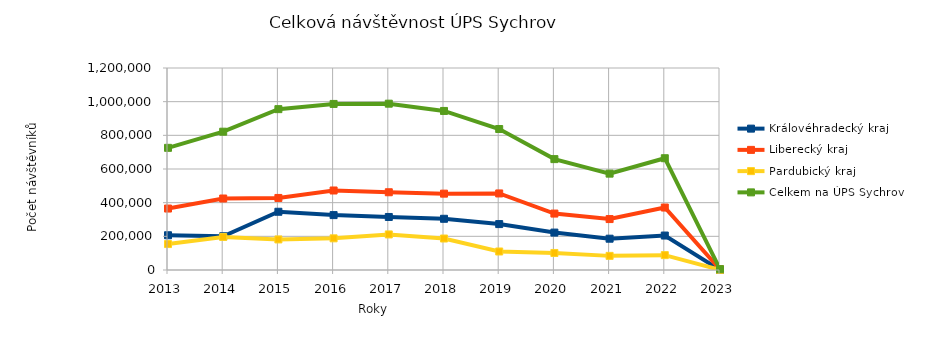
| Category | Královéhradecký kraj | Liberecký kraj | Pardubický kraj | Celkem na ÚPS Sychrov |
|---|---|---|---|---|
| 2013.0 | 206419 | 365108 | 154165 | 725692 |
| 2014.0 | 200438 | 424718 | 196473 | 821629 |
| 2015.0 | 345970 | 428023 | 181567 | 955560 |
| 2016.0 | 326137 | 472318 | 188108 | 986563 |
| 2017.0 | 314983 | 461803 | 211268 | 988054 |
| 2018.0 | 304267 | 453568 | 187017 | 944852 |
| 2019.0 | 272720 | 454785 | 109949 | 837454 |
| 2020.0 | 222238 | 335261 | 101211 | 658710 |
| 2021.0 | 185934 | 302574 | 83925 | 572433 |
| 2022.0 | 204678 | 371041 | 88282 | 664001 |
| 2023.0 | 265 | 3813 | 914 | 4992 |